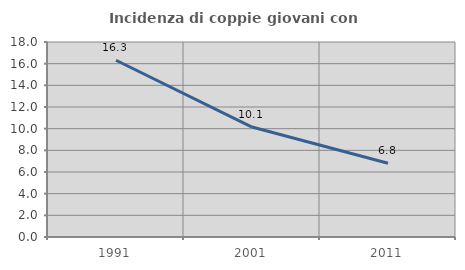
| Category | Incidenza di coppie giovani con figli |
|---|---|
| 1991.0 | 16.317 |
| 2001.0 | 10.149 |
| 2011.0 | 6.81 |